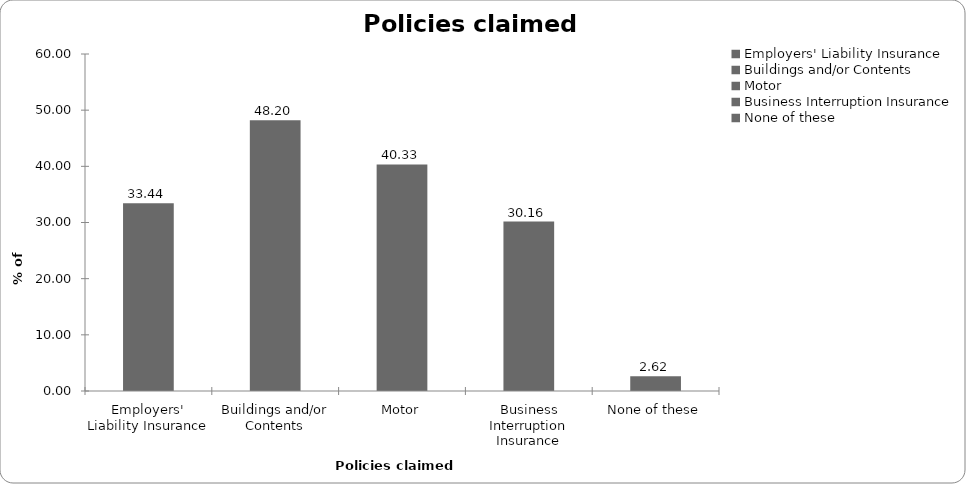
| Category | Series 0 |
|---|---|
| Employers' Liability Insurance | 33.443 |
| Buildings and/or Contents | 48.197 |
| Motor | 40.328 |
| Business Interruption Insurance | 30.164 |
| None of these | 2.623 |